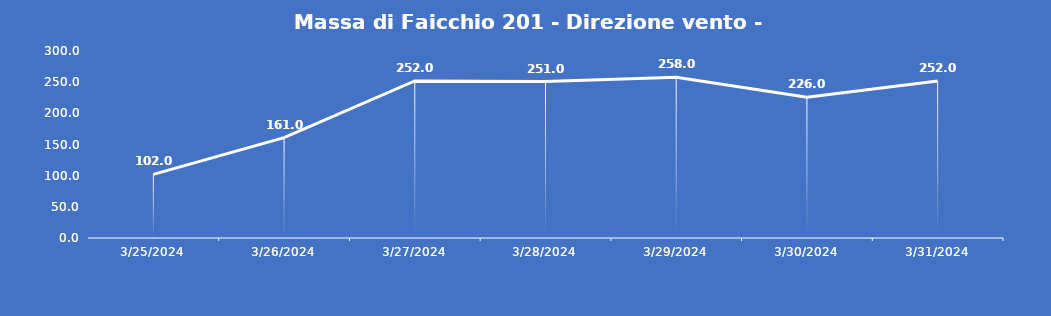
| Category | Massa di Faicchio 201 - Direzione vento - Grezzo (°N) |
|---|---|
| 3/25/24 | 102 |
| 3/26/24 | 161 |
| 3/27/24 | 252 |
| 3/28/24 | 251 |
| 3/29/24 | 258 |
| 3/30/24 | 226 |
| 3/31/24 | 252 |